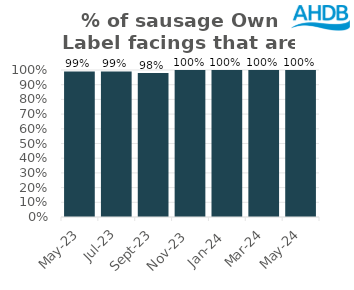
| Category | Sausage |
|---|---|
| 2023-05-01 | 0.99 |
| 2023-07-01 | 0.99 |
| 2023-09-01 | 0.98 |
| 2023-11-01 | 1 |
| 2024-01-01 | 1 |
| 2024-03-01 | 1 |
| 2024-05-01 | 1 |